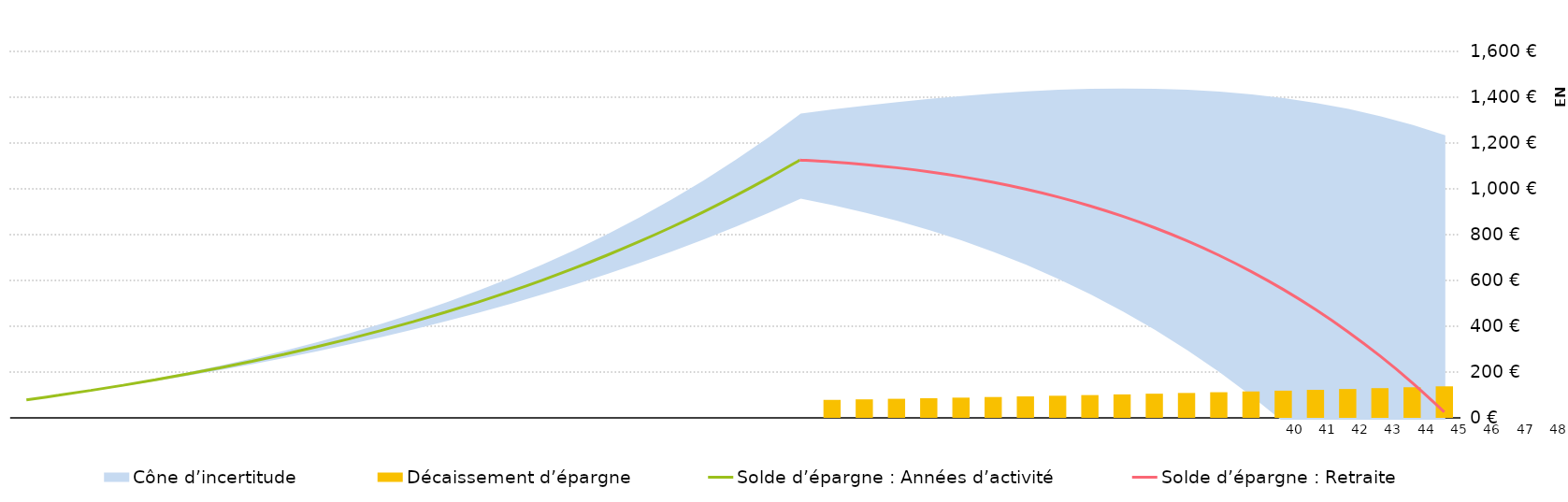
| Category | Décaissement d’épargne |
|---|---|
| 0 | 0 |
| 1 | 0 |
| 2 | 0 |
| 3 | 0 |
| 4 | 0 |
| 5 | 0 |
| 6 | 0 |
| 7 | 0 |
| 8 | 0 |
| 9 | 0 |
| 10 | 0 |
| 11 | 0 |
| 12 | 0 |
| 13 | 0 |
| 14 | 0 |
| 15 | 0 |
| 16 | 0 |
| 17 | 0 |
| 18 | 0 |
| 19 | 0 |
| 20 | 0 |
| 21 | 0 |
| 22 | 0 |
| 23 | 0 |
| 24 | 0 |
| 25 | 78516.672 |
| 26 | 80872.173 |
| 27 | 83298.338 |
| 28 | 85797.288 |
| 29 | 88371.206 |
| 30 | 91022.343 |
| 31 | 93753.013 |
| 32 | 96565.603 |
| 33 | 99462.571 |
| 34 | 102446.449 |
| 35 | 105519.842 |
| 36 | 108685.437 |
| 37 | 111946 |
| 38 | 115304.38 |
| 39 | 118763.512 |
| 40 | 122326.417 |
| 41 | 125996.21 |
| 42 | 129776.096 |
| 43 | 133669.379 |
| 44 | 137679.46 |